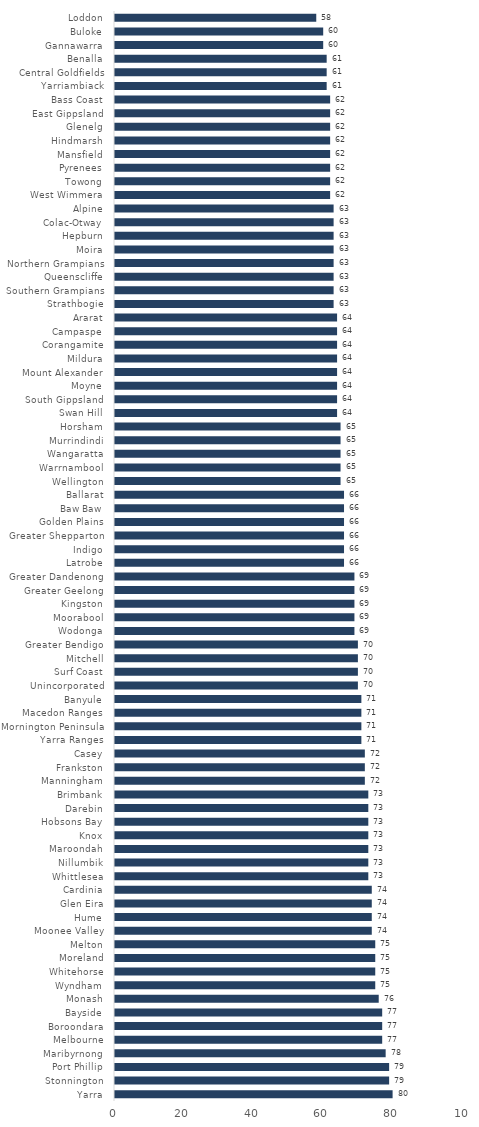
| Category | Series 0 |
|---|---|
| Yarra | 80 |
| Stonnington | 79 |
| Port Phillip | 79 |
| Maribyrnong | 78 |
| Melbourne | 77 |
| Boroondara | 77 |
| Bayside | 77 |
| Monash | 76 |
| Wyndham | 75 |
| Whitehorse | 75 |
| Moreland | 75 |
| Melton | 75 |
| Moonee Valley | 74 |
| Hume | 74 |
| Glen Eira | 74 |
| Cardinia | 74 |
| Whittlesea | 73 |
| Nillumbik | 73 |
| Maroondah | 73 |
| Knox | 73 |
| Hobsons Bay | 73 |
| Darebin | 73 |
| Brimbank | 73 |
| Manningham | 72 |
| Frankston | 72 |
| Casey | 72 |
| Yarra Ranges | 71 |
| Mornington Peninsula | 71 |
| Macedon Ranges | 71 |
| Banyule | 71 |
| Unincorporated | 70 |
| Surf Coast | 70 |
| Mitchell | 70 |
| Greater Bendigo | 70 |
| Wodonga | 69 |
| Moorabool | 69 |
| Kingston | 69 |
| Greater Geelong | 69 |
| Greater Dandenong | 69 |
| Latrobe | 66 |
| Indigo | 66 |
| Greater Shepparton | 66 |
| Golden Plains | 66 |
| Baw Baw | 66 |
| Ballarat | 66 |
| Wellington | 65 |
| Warrnambool | 65 |
| Wangaratta | 65 |
| Murrindindi | 65 |
| Horsham | 65 |
| Swan Hill | 64 |
| South Gippsland | 64 |
| Moyne | 64 |
| Mount Alexander | 64 |
| Mildura | 64 |
| Corangamite | 64 |
| Campaspe | 64 |
| Ararat | 64 |
| Strathbogie | 63 |
| Southern Grampians | 63 |
| Queenscliffe | 63 |
| Northern Grampians | 63 |
| Moira | 63 |
| Hepburn | 63 |
| Colac-Otway | 63 |
| Alpine | 63 |
| West Wimmera | 62 |
| Towong | 62 |
| Pyrenees | 62 |
| Mansfield | 62 |
| Hindmarsh | 62 |
| Glenelg | 62 |
| East Gippsland | 62 |
| Bass Coast | 62 |
| Yarriambiack | 61 |
| Central Goldfields | 61 |
| Benalla | 61 |
| Gannawarra | 60 |
| Buloke | 60 |
| Loddon | 58 |